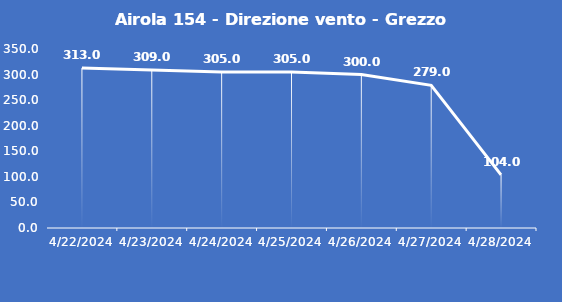
| Category | Airola 154 - Direzione vento - Grezzo (°N) |
|---|---|
| 4/22/24 | 313 |
| 4/23/24 | 309 |
| 4/24/24 | 305 |
| 4/25/24 | 305 |
| 4/26/24 | 300 |
| 4/27/24 | 279 |
| 4/28/24 | 104 |